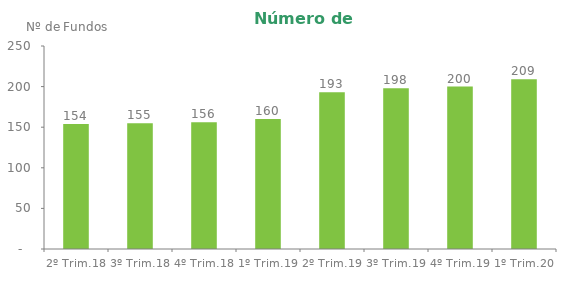
| Category | Series 0 |
|---|---|
| 2º Trim.18 | 154 |
| 3º Trim.18 | 155 |
| 4º Trim.18 | 156 |
| 1º Trim.19 | 160 |
| 2º Trim.19 | 193 |
| 3º Trim.19 | 198 |
| 4º Trim.19 | 200 |
| 1º Trim.20 | 209 |